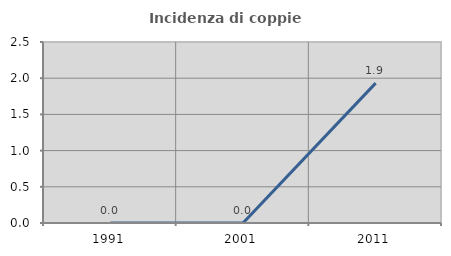
| Category | Incidenza di coppie miste |
|---|---|
| 1991.0 | 0 |
| 2001.0 | 0 |
| 2011.0 | 1.932 |